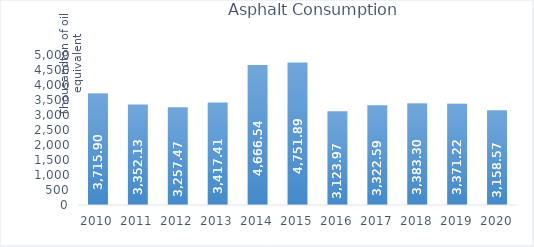
| Category | Asphalt Consumption |
|---|---|
| 2010.0 | 3715.9 |
| 2011.0 | 3352.13 |
| 2012.0 | 3257.47 |
| 2013.0 | 3417.41 |
| 2014.0 | 4666.54 |
| 2015.0 | 4751.89 |
| 2016.0 | 3123.97 |
| 2017.0 | 3322.59 |
| 2018.0 | 3383.3 |
| 2019.0 | 3371.22 |
| 2020.0 | 3158.57 |